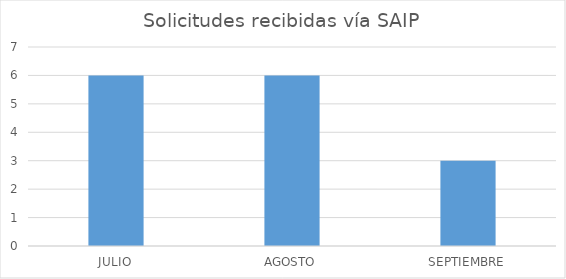
| Category | Series 0 |
|---|---|
| JULIO | 6 |
| AGOSTO | 6 |
| SEPTIEMBRE | 3 |